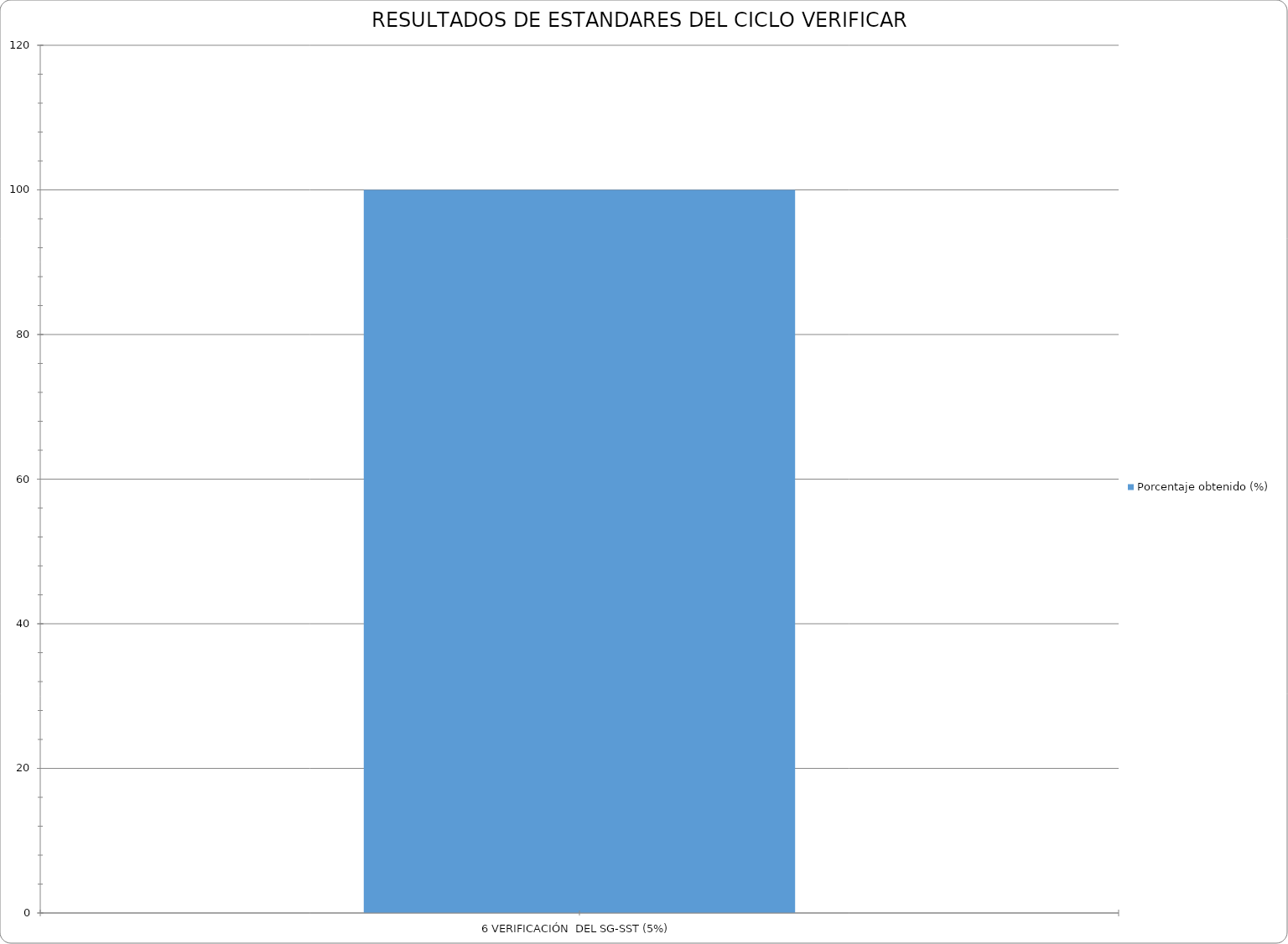
| Category | Porcentaje obtenido (%) |
|---|---|
| 6 VERIFICACIÓN  DEL SG-SST (5%) | 100 |